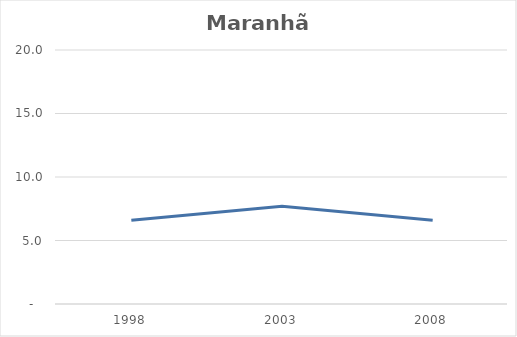
| Category | Maranhão |
|---|---|
| 1998.0 | 6.6 |
| 2003.0 | 7.7 |
| 2008.0 | 6.6 |